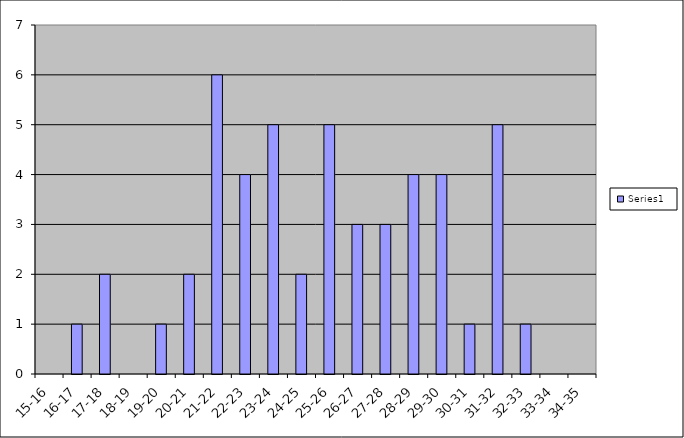
| Category | Series 0 |
|---|---|
| 15-16 | 0 |
| 16-17 | 1 |
| 17-18 | 2 |
| 18-19 | 0 |
| 19-20 | 1 |
| 20-21 | 2 |
| 21-22 | 6 |
| 22-23 | 4 |
| 23-24 | 5 |
| 24-25 | 2 |
| 25-26 | 5 |
| 26-27 | 3 |
| 27-28 | 3 |
| 28-29 | 4 |
| 29-30 | 4 |
| 30-31 | 1 |
| 31-32 | 5 |
| 32-33 | 1 |
| 33-34 | 0 |
| 34-35 | 0 |